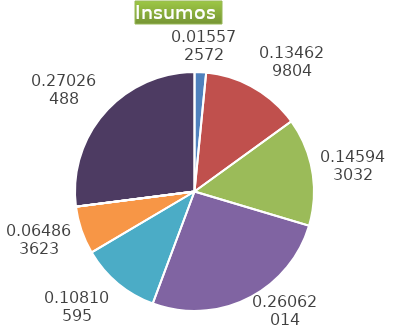
| Category | Series 0 |
|---|---|
| Control arvenses | 263144 |
| Control fitosanitario | 2274963 |
| Cosecha y beneficio | 2466132.967 |
| Fertilización | 4403937 |
| Instalación | 1826765.161 |
| Otros | 1096060 |
| Podas | 0 |
| Riego | 0 |
| Transporte | 0 |
| Tutorado | 4566913 |